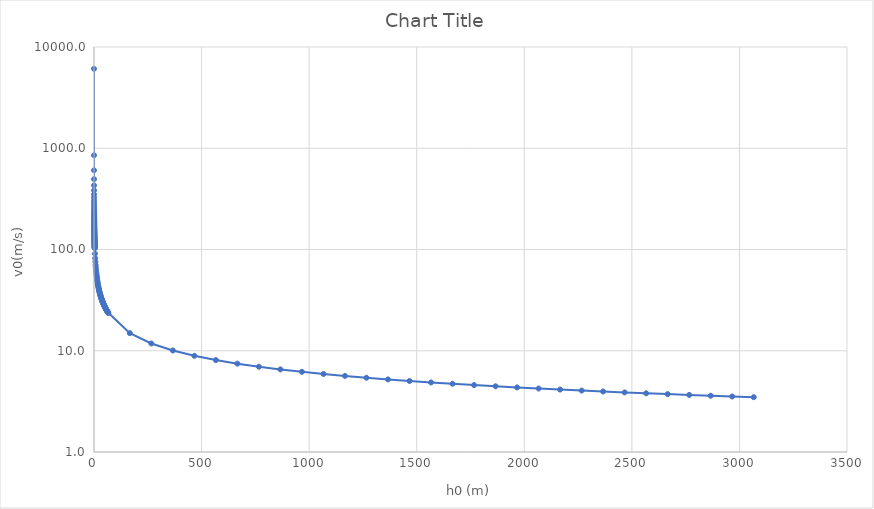
| Category | Series 0 |
|---|---|
| 0.001 | 6090 |
| 0.051000000000000004 | 852.771 |
| 0.101 | 605.978 |
| 0.15100000000000002 | 495.597 |
| 0.201 | 429.555 |
| 0.251 | 384.397 |
| 0.301 | 351.022 |
| 0.351 | 325.06 |
| 0.40099999999999997 | 304.12 |
| 0.45099999999999996 | 286.767 |
| 0.501 | 272.081 |
| 0.551 | 259.443 |
| 0.6010000000000001 | 248.416 |
| 0.6510000000000001 | 238.686 |
| 0.7010000000000002 | 230.016 |
| 0.7510000000000002 | 222.227 |
| 0.8010000000000003 | 215.18 |
| 0.8510000000000003 | 208.763 |
| 0.9010000000000004 | 202.887 |
| 0.9510000000000004 | 197.482 |
| 1.0010000000000003 | 192.486 |
| 1.0510000000000004 | 187.852 |
| 1.1010000000000004 | 183.537 |
| 1.1510000000000005 | 179.506 |
| 1.2010000000000005 | 175.73 |
| 1.2510000000000006 | 172.182 |
| 1.3010000000000006 | 168.841 |
| 1.3510000000000006 | 165.687 |
| 1.4010000000000007 | 162.704 |
| 1.4510000000000007 | 159.876 |
| 1.5010000000000008 | 157.191 |
| 1.5510000000000008 | 154.636 |
| 1.6010000000000009 | 152.202 |
| 1.651000000000001 | 149.88 |
| 1.701000000000001 | 147.661 |
| 1.751000000000001 | 145.537 |
| 1.801000000000001 | 143.503 |
| 1.851000000000001 | 141.551 |
| 1.9010000000000011 | 139.677 |
| 1.9510000000000012 | 137.876 |
| 2.0010000000000012 | 136.143 |
| 2.051000000000001 | 134.473 |
| 2.101000000000001 | 132.863 |
| 2.1510000000000007 | 131.31 |
| 2.2010000000000005 | 129.81 |
| 2.2510000000000003 | 128.36 |
| 2.301 | 126.958 |
| 2.351 | 125.6 |
| 2.401 | 124.286 |
| 2.4509999999999996 | 123.011 |
| 2.5009999999999994 | 121.776 |
| 2.5509999999999993 | 120.576 |
| 2.600999999999999 | 119.412 |
| 2.650999999999999 | 118.28 |
| 2.7009999999999987 | 117.18 |
| 2.7509999999999986 | 116.111 |
| 2.8009999999999984 | 115.07 |
| 2.850999999999998 | 114.056 |
| 2.900999999999998 | 113.069 |
| 2.950999999999998 | 112.107 |
| 3.0009999999999977 | 111.169 |
| 3.0509999999999975 | 110.254 |
| 3.1009999999999973 | 109.362 |
| 3.150999999999997 | 108.491 |
| 3.200999999999997 | 107.64 |
| 3.250999999999997 | 106.809 |
| 3.3009999999999966 | 105.997 |
| 3.3509999999999964 | 105.203 |
| 3.4009999999999962 | 104.427 |
| 3.450999999999996 | 103.668 |
| 3.500999999999996 | 102.925 |
| 4.500999999999996 | 90.774 |
| 5.500999999999996 | 82.11 |
| 6.500999999999996 | 75.531 |
| 7.500999999999996 | 70.317 |
| 8.500999999999996 | 66.051 |
| 9.500999999999996 | 62.479 |
| 10.500999999999996 | 59.429 |
| 11.500999999999996 | 56.787 |
| 12.500999999999996 | 54.468 |
| 13.500999999999996 | 52.412 |
| 14.500999999999996 | 50.573 |
| 15.500999999999996 | 48.914 |
| 16.500999999999998 | 47.409 |
| 17.500999999999998 | 46.035 |
| 18.500999999999998 | 44.773 |
| 19.500999999999998 | 43.61 |
| 20.500999999999998 | 42.533 |
| 21.500999999999998 | 41.532 |
| 22.500999999999998 | 40.599 |
| 23.500999999999998 | 39.726 |
| 24.500999999999998 | 38.907 |
| 25.500999999999998 | 38.136 |
| 26.500999999999998 | 37.41 |
| 27.500999999999998 | 36.723 |
| 28.500999999999998 | 36.073 |
| 29.500999999999998 | 35.457 |
| 30.500999999999998 | 34.871 |
| 31.500999999999998 | 34.313 |
| 32.501 | 33.781 |
| 33.501 | 33.273 |
| 34.501 | 32.787 |
| 35.501 | 32.322 |
| 36.501 | 31.876 |
| 37.501 | 31.448 |
| 38.501 | 31.037 |
| 39.501 | 30.642 |
| 40.501 | 30.261 |
| 41.501 | 29.894 |
| 42.501 | 29.54 |
| 43.501 | 29.199 |
| 44.501 | 28.869 |
| 45.501 | 28.55 |
| 46.501 | 28.241 |
| 47.501 | 27.943 |
| 48.501 | 27.653 |
| 49.501 | 27.372 |
| 50.501 | 27.1 |
| 51.501 | 26.835 |
| 52.501 | 26.579 |
| 53.501 | 26.329 |
| 54.501 | 26.086 |
| 55.501 | 25.85 |
| 56.501 | 25.621 |
| 57.501 | 25.397 |
| 58.501 | 25.179 |
| 59.501 | 24.966 |
| 60.501 | 24.759 |
| 61.501 | 24.557 |
| 62.501 | 24.36 |
| 63.501 | 24.167 |
| 64.501 | 23.979 |
| 65.501 | 23.795 |
| 66.501 | 23.616 |
| 166.501 | 14.925 |
| 266.501 | 11.797 |
| 366.501 | 10.06 |
| 466.501 | 8.916 |
| 566.501 | 8.091 |
| 666.501 | 7.46 |
| 766.501 | 6.956 |
| 866.501 | 6.542 |
| 966.501 | 6.195 |
| 1066.501 | 5.897 |
| 1166.501 | 5.639 |
| 1266.501 | 5.411 |
| 1366.501 | 5.21 |
| 1466.501 | 5.029 |
| 1566.501 | 4.866 |
| 1666.501 | 4.718 |
| 1766.501 | 4.582 |
| 1866.501 | 4.458 |
| 1966.501 | 4.343 |
| 2066.501 | 4.236 |
| 2166.501 | 4.137 |
| 2266.501 | 4.045 |
| 2366.501 | 3.959 |
| 2466.501 | 3.878 |
| 2566.501 | 3.801 |
| 2666.501 | 3.729 |
| 2766.501 | 3.661 |
| 2866.501 | 3.597 |
| 2966.501 | 3.536 |
| 3066.501 | 3.478 |